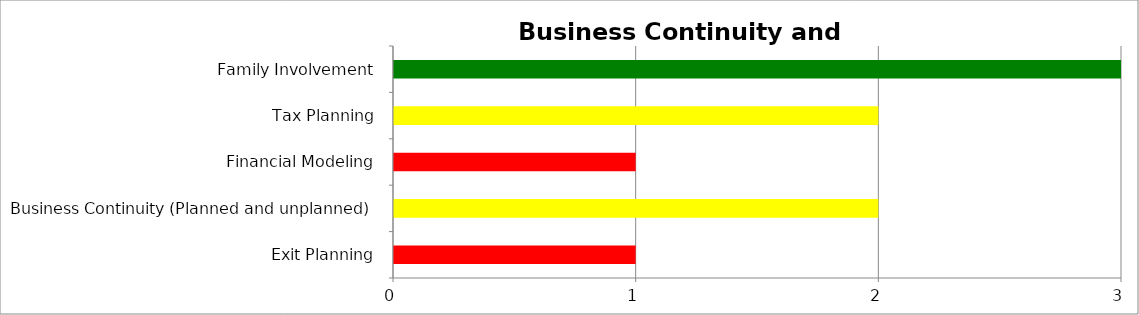
| Category | Series 0 | Series 1 | Series 2 |
|---|---|---|---|
| Exit Planning | 0 | 0 | 1 |
| Business Continuity (Planned and unplanned) | 0 | 2 | 0 |
| Financial Modeling | 0 | 0 | 1 |
| Tax Planning | 0 | 2 | 0 |
| Family Involvement | 3 | 0 | 0 |